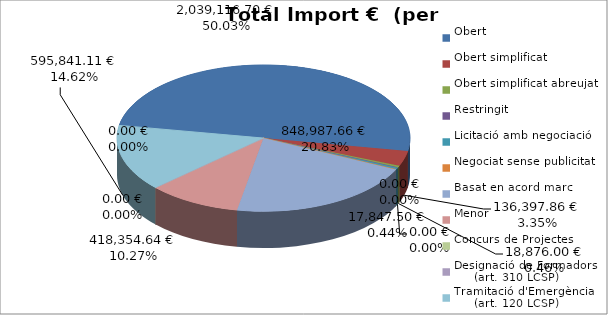
| Category | Total preu
(amb IVA) |
|---|---|
| Obert | 2039116.696 |
| Obert simplificat | 136397.855 |
| Obert simplificat abreujat | 18876 |
| Restringit | 0 |
| Licitació amb negociació | 17847.5 |
| Negociat sense publicitat | 0 |
| Basat en acord marc | 848987.663 |
| Menor | 418354.64 |
| Concurs de Projectes | 0 |
| Designació de Formadors
     (art. 310 LCSP) | 0 |
| Tramitació d'Emergència
     (art. 120 LCSP) | 595841.11 |